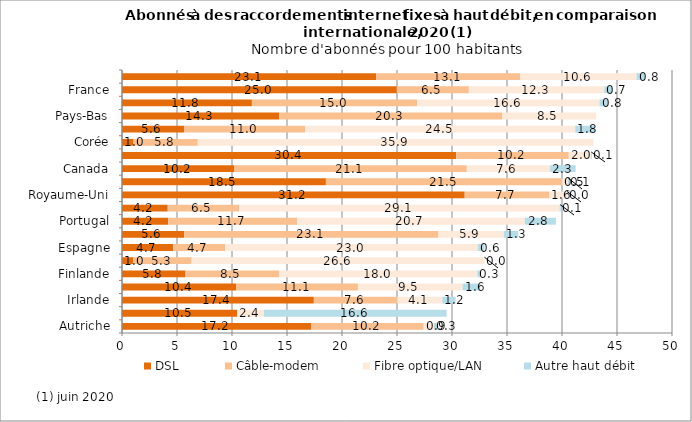
| Category | DSL  | Câble-modem | Fibre optique/LAN | Autre haut débit  |
|---|---|---|---|---|
| Autriche | 17.184 | 10.241 | 0.938 | 0.321 |
| Italie | 10.484 | 0 | 2.42 | 16.609 |
| Irlande | 17.439 | 7.597 | 4.082 | 1.208 |
| OCDE | 10.381 | 11.069 | 9.517 | 1.607 |
| Finlande | 5.777 | 8.53 | 18.002 | 0.307 |
| Japon | 1.035 | 5.294 | 26.623 | 0.003 |
| Espagne | 4.655 | 4.725 | 22.969 | 0.607 |
| États-Unis | 5.648 | 23.122 | 5.943 | 1.304 |
| Portugal | 4.207 | 11.7 | 20.719 | 2.82 |
| Suède | 4.159 | 6.482 | 29.133 | 0.125 |
| Royaume-Uni | 31.155 | 7.703 | 1.58 | 0.043 |
| Belgique | 18.536 | 21.48 | 0.515 | 0.112 |
| Canada | 10.215 | 21.129 | 7.571 | 2.325 |
| Allemagne | 30.386 | 10.231 | 2.002 | 0.098 |
| Corée | 1.049 | 5.844 | 35.948 | 0 |
| Norvège | 5.64 | 11.025 | 24.537 | 1.792 |
| Pays-Bas | 14.293 | 20.292 | 8.518 | 0 |
| Danemark | 11.808 | 15.024 | 16.583 | 0.797 |
| France | 24.985 | 6.545 | 12.319 | 0.734 |
| Suisse | 23.105 | 13.116 | 10.554 | 0.78 |